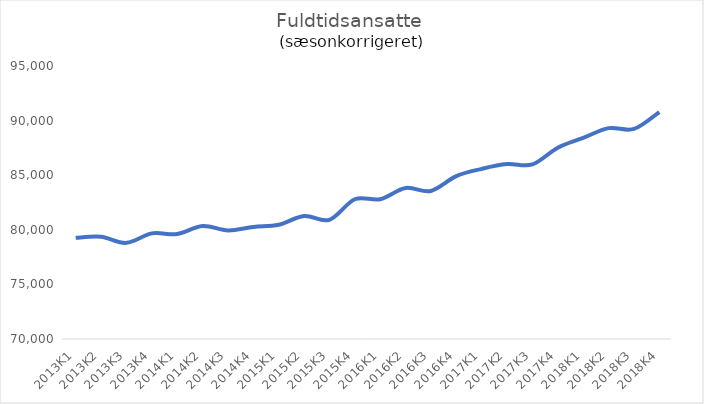
| Category | It-branchen i alt |
|---|---|
| 2013K1 | 79262.51 |
| 2013K2 | 79362.338 |
| 2013K3 | 78804.929 |
| 2013K4 | 79672.024 |
| 2014K1 | 79615.052 |
| 2014K2 | 80353.174 |
| 2014K3 | 79941.233 |
| 2014K4 | 80256.933 |
| 2015K1 | 80464.937 |
| 2015K2 | 81264.144 |
| 2015K3 | 80910.21 |
| 2015K4 | 82796.507 |
| 2016K1 | 82801.215 |
| 2016K2 | 83830.188 |
| 2016K3 | 83557.575 |
| 2016K4 | 84912.901 |
| 2017K1 | 85576.798 |
| 2017K2 | 86016.212 |
| 2017K3 | 85991.018 |
| 2017K4 | 87521.221 |
| 2018K1 | 88415.631 |
| 2018K2 | 89312.365 |
| 2018K3 | 89234.1 |
| 2018K4 | 90782.047 |